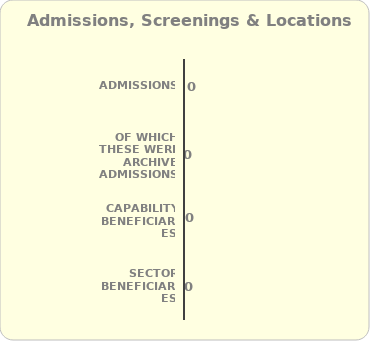
| Category | Series 0 |
|---|---|
| ADMISSIONS  | 0 |
| of which these were ARCHIVE ADMISSIONS | 0 |
| CAPABILITY Beneficiaries | 0 |
| SECTOR Beneficiaries | 0 |